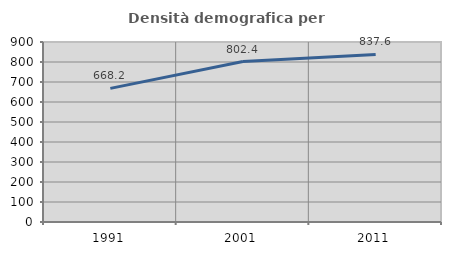
| Category | Densità demografica |
|---|---|
| 1991.0 | 668.234 |
| 2001.0 | 802.367 |
| 2011.0 | 837.622 |